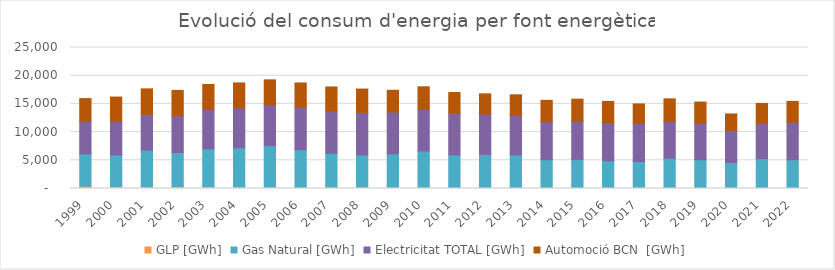
| Category | GLP [GWh] | Gas Natural [GWh] | Electricitat TOTAL [GWh] | Automoció BCN  [GWh] |
|---|---|---|---|---|
| 1999.0 | 414.982 | 5699.669 | 5824.203 | 4004.287 |
| 2000.0 | 346.842 | 5596.887 | 5985.965 | 4281.69 |
| 2001.0 | 306.386 | 6477.422 | 6370.79 | 4508.517 |
| 2002.0 | 356.242 | 6025.753 | 6512.642 | 4496.23 |
| 2003.0 | 335.16 | 6715.716 | 6940.48 | 4457.147 |
| 2004.0 | 317.398 | 6880.03 | 7082.97 | 4438.621 |
| 2005.0 | 298.89 | 7302.235 | 7285.84 | 4376.336 |
| 2006.0 | 251.968 | 6631.918 | 7492.5 | 4338.835 |
| 2007.0 | 235.051 | 5991.495 | 7508.56 | 4267.838 |
| 2008.0 | 233.122 | 5725.788 | 7536.66 | 4134.057 |
| 2009.0 | 231.192 | 5921.481 | 7404.425 | 3850.821 |
| 2010.0 | 229.263 | 6432.535 | 7439.15 | 3935.929 |
| 2011.0 | 194.502 | 5744.925 | 7445.389 | 3633.811 |
| 2012.0 | 187.387 | 5863.392 | 7162.799 | 3568.434 |
| 2013.0 | 173.923 | 5777.021 | 7014.374 | 3643.866 |
| 2014.0 | 155.31 | 4957.09 | 6735.589 | 3779.577 |
| 2015.0 | 136.037 | 5023.173 | 6811.569 | 3871.08 |
| 2016.0 | 143.005 | 4781.488 | 6756.514 | 3752.729 |
| 2017.0 | 147.98 | 4628.395 | 6820.362 | 3398.57 |
| 2018.0 | 139.607 | 5221.27 | 6584.87 | 3950.475 |
| 2019.0 | 140.155 | 4974.194 | 6453.939 | 3752.165 |
| 2020.0 | 125.512 | 4483.689 | 5695.689 | 2917.198 |
| 2021.0 | 147.88 | 5145.81 | 6256.66 | 3533.74 |
| 2022.0 | 147.88 | 4958.93 | 6643.53 | 3692.22 |